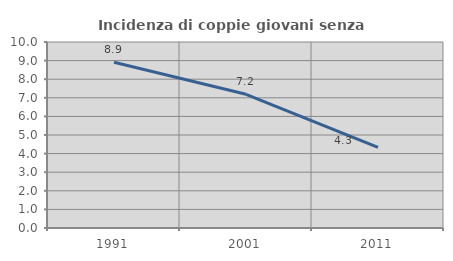
| Category | Incidenza di coppie giovani senza figli |
|---|---|
| 1991.0 | 8.912 |
| 2001.0 | 7.189 |
| 2011.0 | 4.339 |